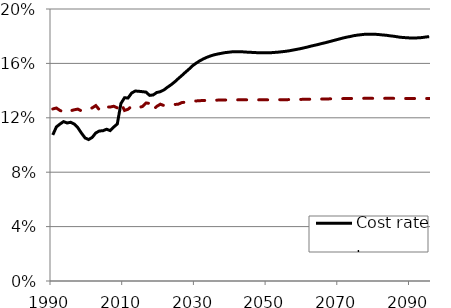
| Category | Cost rate | Income rate |
|---|---|---|
| 1990.0 | 0.107 | 0.126 |
| 1991.0 | 0.113 | 0.127 |
| 1992.0 | 0.115 | 0.125 |
| 1993.0 | 0.117 | 0.124 |
| 1994.0 | 0.116 | 0.126 |
| 1995.0 | 0.117 | 0.125 |
| 1996.0 | 0.115 | 0.126 |
| 1997.0 | 0.113 | 0.126 |
| 1998.0 | 0.109 | 0.125 |
| 1999.0 | 0.105 | 0.126 |
| 2000.0 | 0.104 | 0.126 |
| 2001.0 | 0.106 | 0.127 |
| 2002.0 | 0.109 | 0.129 |
| 2003.0 | 0.11 | 0.126 |
| 2004.0 | 0.11 | 0.125 |
| 2005.0 | 0.112 | 0.128 |
| 2006.0 | 0.111 | 0.128 |
| 2007.0 | 0.113 | 0.128 |
| 2008.0 | 0.116 | 0.127 |
| 2009.0 | 0.13 | 0.131 |
| 2010.0 | 0.135 | 0.125 |
| 2011.0 | 0.135 | 0.126 |
| 2012.0 | 0.138 | 0.128 |
| 2013.0 | 0.14 | 0.128 |
| 2014.0 | 0.139 | 0.128 |
| 2015.0 | 0.139 | 0.128 |
| 2016.0 | 0.139 | 0.131 |
| 2017.0 | 0.136 | 0.131 |
| 2018.0 | 0.137 | 0.126 |
| 2019.0 | 0.139 | 0.128 |
| 2020.0 | 0.139 | 0.13 |
| 2021.0 | 0.14 | 0.129 |
| 2022.0 | 0.142 | 0.129 |
| 2023.0 | 0.144 | 0.129 |
| 2024.0 | 0.146 | 0.13 |
| 2025.0 | 0.149 | 0.13 |
| 2026.0 | 0.151 | 0.131 |
| 2027.0 | 0.154 | 0.132 |
| 2028.0 | 0.156 | 0.132 |
| 2029.0 | 0.158 | 0.132 |
| 2030.0 | 0.16 | 0.132 |
| 2031.0 | 0.162 | 0.133 |
| 2032.0 | 0.163 | 0.133 |
| 2033.0 | 0.164 | 0.133 |
| 2034.0 | 0.166 | 0.133 |
| 2035.0 | 0.166 | 0.133 |
| 2036.0 | 0.167 | 0.133 |
| 2037.0 | 0.167 | 0.133 |
| 2038.0 | 0.168 | 0.133 |
| 2039.0 | 0.168 | 0.133 |
| 2040.0 | 0.168 | 0.133 |
| 2041.0 | 0.169 | 0.133 |
| 2042.0 | 0.169 | 0.133 |
| 2043.0 | 0.168 | 0.133 |
| 2044.0 | 0.168 | 0.133 |
| 2045.0 | 0.168 | 0.133 |
| 2046.0 | 0.168 | 0.133 |
| 2047.0 | 0.168 | 0.133 |
| 2048.0 | 0.168 | 0.133 |
| 2049.0 | 0.168 | 0.133 |
| 2050.0 | 0.168 | 0.133 |
| 2051.0 | 0.168 | 0.133 |
| 2052.0 | 0.168 | 0.133 |
| 2053.0 | 0.168 | 0.133 |
| 2054.0 | 0.169 | 0.133 |
| 2055.0 | 0.169 | 0.133 |
| 2056.0 | 0.169 | 0.133 |
| 2057.0 | 0.17 | 0.133 |
| 2058.0 | 0.17 | 0.134 |
| 2059.0 | 0.171 | 0.134 |
| 2060.0 | 0.171 | 0.134 |
| 2061.0 | 0.172 | 0.134 |
| 2062.0 | 0.173 | 0.134 |
| 2063.0 | 0.173 | 0.134 |
| 2064.0 | 0.174 | 0.134 |
| 2065.0 | 0.175 | 0.134 |
| 2066.0 | 0.175 | 0.134 |
| 2067.0 | 0.176 | 0.134 |
| 2068.0 | 0.177 | 0.134 |
| 2069.0 | 0.177 | 0.134 |
| 2070.0 | 0.178 | 0.134 |
| 2071.0 | 0.179 | 0.134 |
| 2072.0 | 0.179 | 0.134 |
| 2073.0 | 0.18 | 0.134 |
| 2074.0 | 0.18 | 0.134 |
| 2075.0 | 0.181 | 0.134 |
| 2076.0 | 0.181 | 0.134 |
| 2077.0 | 0.181 | 0.134 |
| 2078.0 | 0.182 | 0.134 |
| 2079.0 | 0.182 | 0.134 |
| 2080.0 | 0.181 | 0.134 |
| 2081.0 | 0.181 | 0.134 |
| 2082.0 | 0.181 | 0.134 |
| 2083.0 | 0.181 | 0.134 |
| 2084.0 | 0.18 | 0.134 |
| 2085.0 | 0.18 | 0.134 |
| 2086.0 | 0.18 | 0.134 |
| 2087.0 | 0.179 | 0.134 |
| 2088.0 | 0.179 | 0.134 |
| 2089.0 | 0.179 | 0.134 |
| 2090.0 | 0.179 | 0.134 |
| 2091.0 | 0.179 | 0.134 |
| 2092.0 | 0.179 | 0.134 |
| 2093.0 | 0.179 | 0.134 |
| 2094.0 | 0.179 | 0.134 |
| 2095.0 | 0.18 | 0.134 |